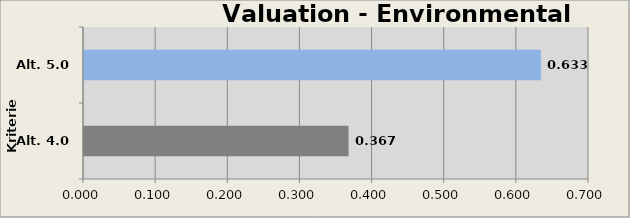
| Category | Valuation Environmental Module  |
|---|---|
| Alt. 4.0 m | 0.367 |
| Alt. 5.0 m | 0.633 |